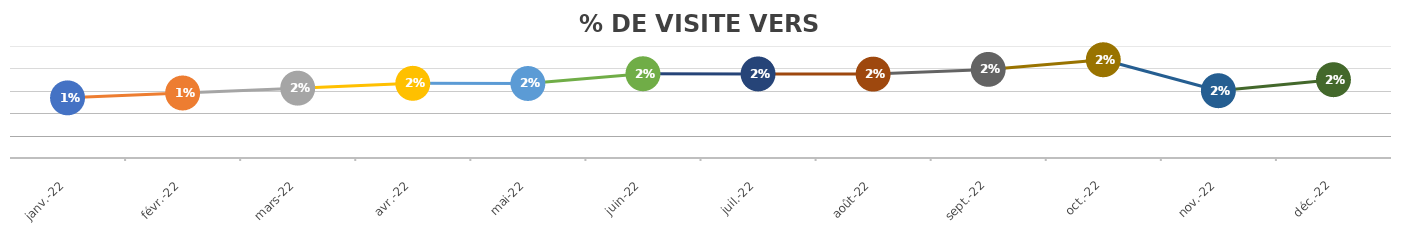
| Category | Series 0 |
|---|---|
| 2022-01-18 | 0.013 |
| 2022-02-18 | 0.015 |
| 2022-03-18 | 0.016 |
| 2022-04-18 | 0.017 |
| 2022-05-18 | 0.017 |
| 2022-06-18 | 0.019 |
| 2022-07-18 | 0.019 |
| 2022-08-18 | 0.019 |
| 2022-09-18 | 0.02 |
| 2022-10-18 | 0.022 |
| 2022-11-18 | 0.015 |
| 2022-12-18 | 0.017 |